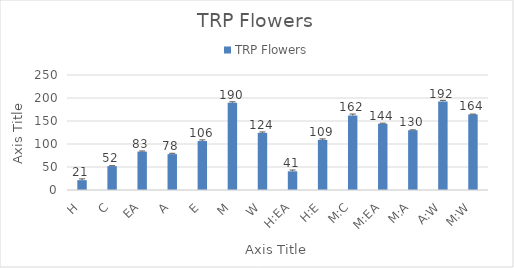
| Category | TRP Flowers |
|---|---|
| H | 21.401 |
| C | 51.919 |
| EA | 83.434 |
| A | 78.029 |
| E | 106.409 |
| M | 189.717 |
| W | 124.142 |
| H:EA | 40.615 |
| H:E | 108.986 |
| M:C | 161.969 |
| M:EA | 144.135 |
| M:A | 129.874 |
| A:W | 192.375 |
| M:W | 164.316 |